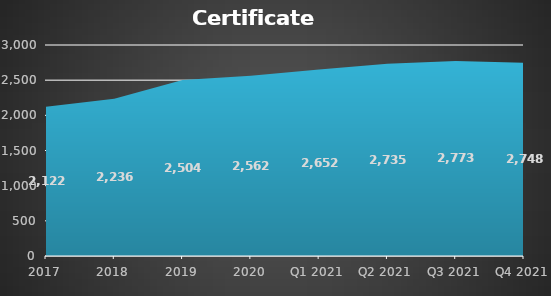
| Category | Certificate holders |
|---|---|
| 2017 | 2122 |
| 2018 | 2236 |
| 2019 | 2504 |
| 2020 | 2562 |
| Q1 2021 | 2652 |
| Q2 2021 | 2735 |
| Q3 2021 | 2773 |
| Q4 2021 | 2748 |